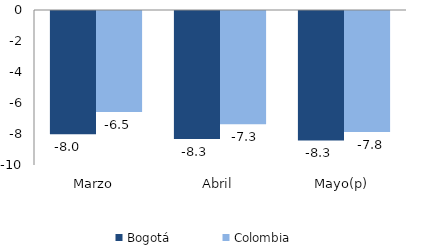
| Category | Bogotá | Colombia |
|---|---|---|
| Marzo | -7.955 | -6.518 |
| Abril | -8.263 | -7.304 |
| Mayo(p) | -8.35 | -7.807 |